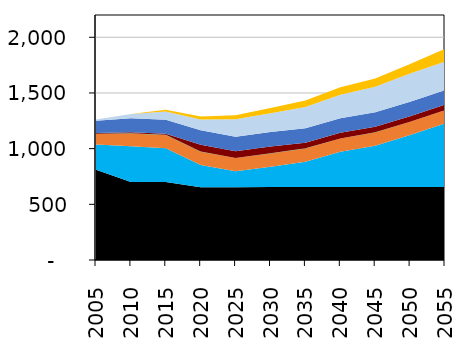
| Category | Series 1 | Series 0 | Series 2 | Series 3 | Series 4 | Series 5 | Series 6 | Series 7 | Series 8 | Series 9 | Series 10 | Series 11 | Series 12 |
|---|---|---|---|---|---|---|---|---|---|---|---|---|---|
| 2005.0 | 0 | 811.16 | 0 | 226.05 | 0.51 | 93.83 | 0 | 0 | 1.21 | 7.9 | 110.21 | 10.45 | 1.24 |
| 2010.0 | 0 | 701.48 | 0 | 319.09 | 0.75 | 114.57 | 0 | 0 | 1.21 | 10.72 | 125.19 | 38.5 | 0.31 |
| 2015.0 | 0 | 701.25 | 0 | 302.56 | 0.52 | 118.68 | 0 | 0 | 1.21 | 9.38 | 126.46 | 72.7 | 16.65 |
| 2020.0 | 0 | 652.5 | 0 | 201.07 | 0.03 | 118.68 | 0 | 0 | 1.21 | 61.19 | 129.93 | 96.29 | 26.91 |
| 2025.0 | 0 | 654.37 | 0 | 141.78 | 0.02 | 118.68 | 0 | 0 | 1.26 | 61.19 | 129.93 | 156.47 | 37.16 |
| 2030.0 | 0 | 655.23 | 0 | 183.09 | 0.02 | 118.68 | 0 | 0 | 1.21 | 61.19 | 129.93 | 167.75 | 47.42 |
| 2035.0 | 0 | 655.23 | 0 | 227.96 | 0.02 | 118.68 | 0 | 0 | 1.21 | 50.47 | 129.93 | 190.51 | 57.45 |
| 2040.0 | 0 | 655.23 | 0 | 316.23 | 0.02 | 118.68 | 0 | 0 | 1.21 | 50.47 | 129.93 | 211.62 | 67.71 |
| 2045.0 | 0 | 655.23 | 0 | 371.43 | 0.02 | 118.68 | 0 | 0 | 1.21 | 50.47 | 129.93 | 229.83 | 73.78 |
| 2050.0 | 0 | 655.23 | 0 | 467.3 | 0.02 | 118.68 | 0 | 0 | 0 | 50.47 | 129.93 | 253.78 | 84.04 |
| 2055.0 | 0 | 655.23 | 0 | 570.7 | 0.02 | 118.68 | 0 | 0 | 0 | 50.47 | 129.93 | 255.46 | 116.96 |